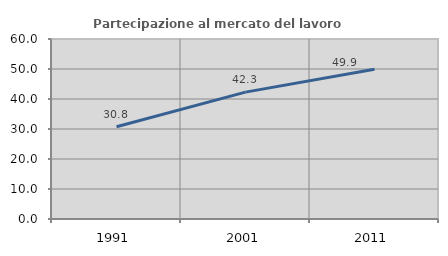
| Category | Partecipazione al mercato del lavoro  femminile |
|---|---|
| 1991.0 | 30.769 |
| 2001.0 | 42.287 |
| 2011.0 | 49.907 |